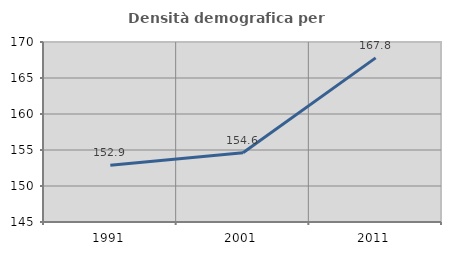
| Category | Densità demografica |
|---|---|
| 1991.0 | 152.869 |
| 2001.0 | 154.605 |
| 2011.0 | 167.792 |